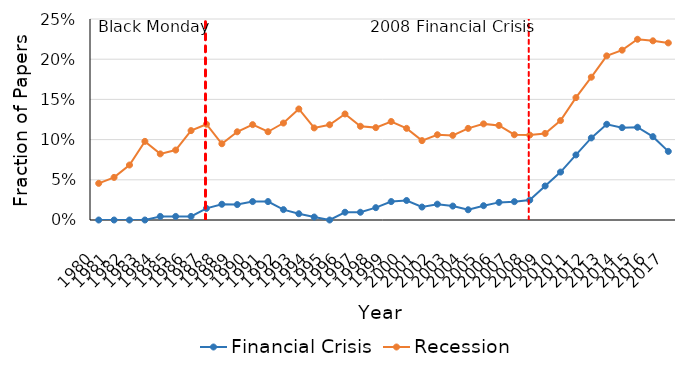
| Category | Financial Crisis | Recession |
|---|---|---|
| 1980.0 | 0 | 0.046 |
| 1981.0 | 0 | 0.053 |
| 1982.0 | 0 | 0.068 |
| 1983.0 | 0 | 0.098 |
| 1984.0 | 0.004 | 0.082 |
| 1985.0 | 0.004 | 0.087 |
| 1986.0 | 0.004 | 0.111 |
| 1987.0 | 0.014 | 0.119 |
| 1988.0 | 0.02 | 0.095 |
| 1989.0 | 0.019 | 0.11 |
| 1990.0 | 0.023 | 0.119 |
| 1991.0 | 0.023 | 0.11 |
| 1992.0 | 0.013 | 0.121 |
| 1993.0 | 0.008 | 0.138 |
| 1994.0 | 0.004 | 0.115 |
| 1995.0 | 0 | 0.118 |
| 1996.0 | 0.01 | 0.132 |
| 1997.0 | 0.01 | 0.117 |
| 1998.0 | 0.015 | 0.115 |
| 1999.0 | 0.023 | 0.122 |
| 2000.0 | 0.024 | 0.114 |
| 2001.0 | 0.016 | 0.099 |
| 2002.0 | 0.02 | 0.106 |
| 2003.0 | 0.017 | 0.105 |
| 2004.0 | 0.013 | 0.114 |
| 2005.0 | 0.018 | 0.12 |
| 2006.0 | 0.022 | 0.118 |
| 2007.0 | 0.023 | 0.106 |
| 2008.0 | 0.025 | 0.106 |
| 2009.0 | 0.042 | 0.108 |
| 2010.0 | 0.06 | 0.124 |
| 2011.0 | 0.081 | 0.152 |
| 2012.0 | 0.102 | 0.178 |
| 2013.0 | 0.119 | 0.204 |
| 2014.0 | 0.115 | 0.211 |
| 2015.0 | 0.115 | 0.225 |
| 2016.0 | 0.104 | 0.223 |
| 2017.0 | 0.085 | 0.22 |